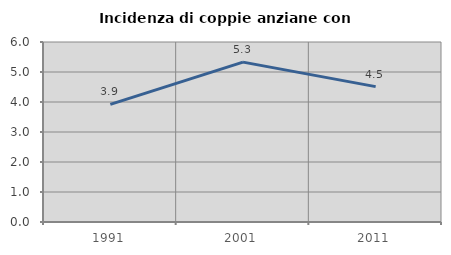
| Category | Incidenza di coppie anziane con figli |
|---|---|
| 1991.0 | 3.919 |
| 2001.0 | 5.329 |
| 2011.0 | 4.512 |